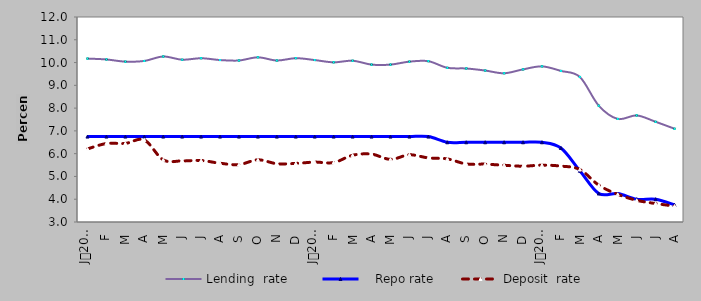
| Category | Lending  rate |    Repo rate | Deposit  rate |
|---|---|---|---|
| 0 | 10.174 | 6.75 | 6.207 |
| 1900-01-01 | 10.136 | 6.75 | 6.446 |
| 1900-01-02 | 10.04 | 6.75 | 6.45 |
| 1900-01-03 | 10.07 | 6.75 | 6.6 |
| 1900-01-04 | 10.265 | 6.75 | 5.728 |
| 1900-01-05 | 10.125 | 6.75 | 5.682 |
| 1900-01-06 | 10.19 | 6.75 | 5.7 |
| 1900-01-07 | 10.11 | 6.75 | 5.58 |
| 1900-01-08 | 10.09 | 6.75 | 5.52 |
| 1900-01-09 | 10.23 | 6.75 | 5.73 |
| 1900-01-10 | 10.09 | 6.75 | 5.56 |
| 1900-01-11 | 10.192 | 6.75 | 5.572 |
| 1900-01-12 | 10.11 | 6.75 | 5.63 |
| 1900-01-13 | 10.01 | 6.75 | 5.61 |
| 1900-01-14 | 10.08 | 6.75 | 5.93 |
| 1900-01-15 | 9.91 | 6.75 | 5.98 |
| 1900-01-16 | 9.91 | 6.75 | 5.75 |
| 1900-01-17 | 10.04 | 6.75 | 5.95 |
| 1900-01-18 | 10.06 | 6.75 | 5.813 |
| 1900-01-19 | 9.77 | 6.5 | 5.77 |
| 1900-01-20 | 9.74 | 6.5 | 5.55 |
| 1900-01-21 | 9.65 | 6.5 | 5.54 |
| 1900-01-22 | 9.53 | 6.5 | 5.49 |
| 1900-01-23 | 9.7 | 6.5 | 5.45 |
| 1900-01-24 | 9.833 | 6.5 | 5.497 |
| 1900-01-25 | 9.634 | 6.25 | 5.454 |
| 1900-01-26 | 9.369 | 5.25 | 5.304 |
| 1900-01-27 | 8.106 | 4.25 | 4.617 |
| 1900-01-28 | 7.526 | 4.25 | 4.216 |
| 1900-01-29 | 7.679 | 4 | 3.952 |
| 1900-01-30 | 7.4 | 4 | 3.81 |
| 1900-01-31 | 7.095 | 3.75 | 3.699 |